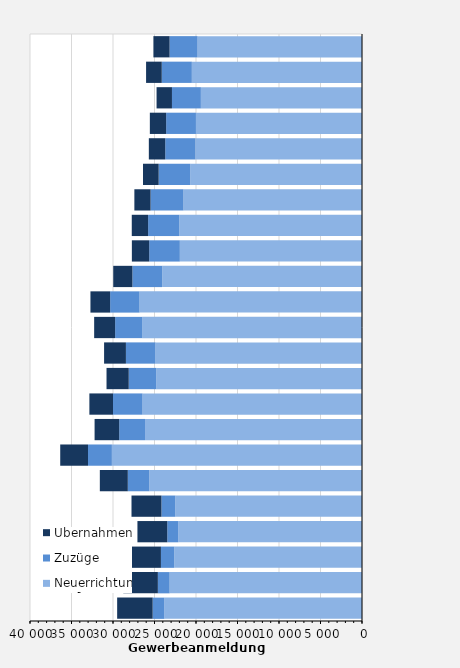
| Category | Neuerrichtungen² | Zuzüge | Übernahmen |
|---|---|---|---|
| 1998.0 | 23806 | 1416 | 4278 |
| 1999.0 | 23180 | 1415 | 4166 |
| 2000.0 | 22620 | 1606 | 3798 |
| 2001.0 | 22133 | 1329 | 3594 |
| 2002.0 | 22491 | 1672 | 3608 |
| 2003.0 | 25624 | 2593 | 3370 |
| 2004.0 | 30135 | 2874 | 3350 |
| 2005.0 | 26140 | 3111 | 2968 |
| 2006.0 | 26444 | 3557 | 2846 |
| 2007.0 | 24775 | 3330 | 2676 |
| 2008.0 | 24884 | 3560 | 2630 |
| 2009.0 | 26499 | 3245 | 2527 |
| 2010.0 | 26806 | 3541 | 2371 |
| 2011.0 | 24066 | 3597 | 2308 |
| 2012.0 | 21948 | 3688 | 2092 |
| 2013.0 | 22013 | 3757 | 1969 |
| 2014.0 | 21509 | 3962 | 1955 |
| 2015.0 | 20698 | 3800 | 1885 |
| 2016.0 | 20075 | 3632 | 1976 |
| 2017.0 | 20008 | 3590 | 1963 |
| 2018.0 | 19413 | 3484 | 1855 |
| 2019.0 | 20501 | 3625 | 1889 |
| 2020.0 | 19811 | 3372 | 1949 |